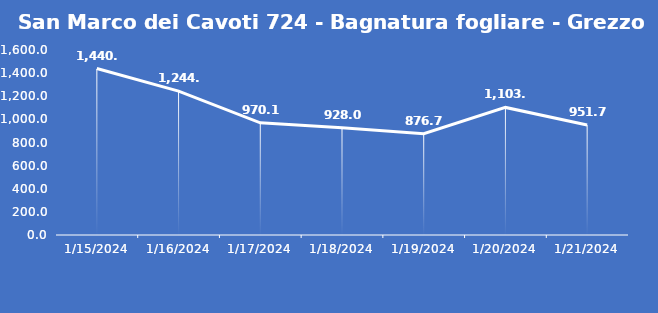
| Category | San Marco dei Cavoti 724 - Bagnatura fogliare - Grezzo (min) |
|---|---|
| 1/15/24 | 1440 |
| 1/16/24 | 1244 |
| 1/17/24 | 970.1 |
| 1/18/24 | 928 |
| 1/19/24 | 876.7 |
| 1/20/24 | 1103.4 |
| 1/21/24 | 951.7 |